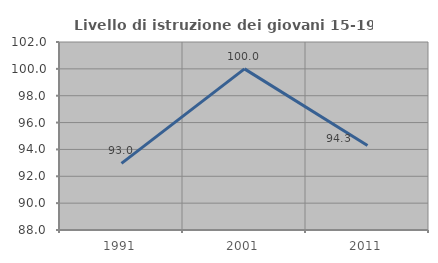
| Category | Livello di istruzione dei giovani 15-19 anni |
|---|---|
| 1991.0 | 92.958 |
| 2001.0 | 100 |
| 2011.0 | 94.286 |